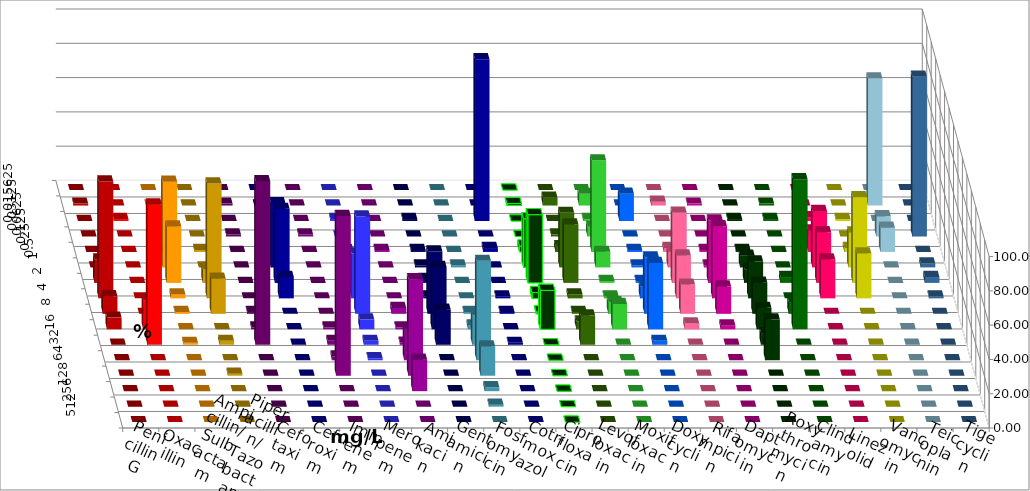
| Category | Penicillin G | Oxacillin | Ampicillin/ Sulbactam | Piperacillin/ Tazobactam | Cefotaxim | Cefuroxim | Imipenem | Meropenem | Amikacin | Gentamicin | Fosfomycin | Cotrimoxazol | Ciprofloxacin | Levofloxacin | Moxifloxacin | Doxycyclin | Rifampicin | Daptomycin | Roxythromycin | Clindamycin | Linezolid | Vancomycin | Teicoplanin | Tigecyclin |
|---|---|---|---|---|---|---|---|---|---|---|---|---|---|---|---|---|---|---|---|---|---|---|---|---|
| 0.015625 | 0 | 0 | 0 | 0 | 0 | 0 | 0 | 0 | 0 | 0 | 0 | 0 | 0 | 0 | 0 | 0 | 0 | 0 | 0 | 0 | 0 | 0 | 0 | 0 |
| 0.03125 | 1.136 | 0 | 0 | 0 | 1.136 | 0 | 0 | 0 | 0 | 0 | 0 | 0 | 1.136 | 4.545 | 6.818 | 0 | 2.273 | 1.136 | 0 | 1.136 | 0 | 0 | 0 | 74.118 |
| 0.0625 | 0 | 1.136 | 0 | 0 | 0 | 0 | 3.409 | 1.136 | 0 | 1.136 | 0 | 94.318 | 0 | 0 | 1.136 | 15.909 | 0 | 0 | 1.136 | 1.136 | 2.273 | 1.136 | 0 | 0 |
| 0.125 | 0 | 0 | 12.5 | 0 | 1.136 | 1.136 | 0 | 0 | 0 | 0 | 0 | 0 | 0 | 1.136 | 5.682 | 0 | 0 | 0 | 0 | 0 | 0 | 0 | 93.182 | 11.765 |
| 0.25 | 0 | 0 | 0 | 1.136 | 0 | 0 | 3.409 | 1.136 | 1.149 | 1.136 | 0 | 2.273 | 3.409 | 3.409 | 53.409 | 1.136 | 2.273 | 1.136 | 1.136 | 0 | 12.5 | 2.273 | 0 | 14.118 |
| 0.5 | 0 | 0 | 50 | 0 | 0 | 0 | 37.5 | 2.273 | 0 | 1.136 | 1.136 | 0 | 28.409 | 31.818 | 9.091 | 1.136 | 9.091 | 1.136 | 6.818 | 0 | 32.955 | 20.455 | 2.273 | 0 |
| 1.0 | 13.636 | 0 | 32.955 | 7.955 | 0 | 0 | 43.182 | 3.409 | 0 | 2.273 | 0 | 0 | 39.773 | 34.091 | 1.136 | 1.136 | 40.909 | 36.364 | 7.955 | 3.409 | 29.545 | 50 | 3.409 | 0 |
| 2.0 | 68.182 | 0 | 2.273 | 67.045 | 0 | 0 | 12.5 | 26.136 | 0 | 1.136 | 0 | 1.136 | 3.409 | 2.273 | 1.136 | 6.818 | 25 | 42.045 | 21.591 | 0 | 22.727 | 26.136 | 1.136 | 0 |
| 4.0 | 10.227 | 0 | 1.136 | 20.455 | 1.136 | 0 | 0 | 56.818 | 3.448 | 36.364 | 1.136 | 1.136 | 1.136 | 1.136 | 6.818 | 32.955 | 17.045 | 15.909 | 18.182 | 6.818 | 0 | 0 | 0 | 0 |
| 8.0 | 6.818 | 17.045 | 0 | 0 | 1.136 | 1.136 | 0 | 5.682 | 1.149 | 36.364 | 2.273 | 0 | 22.727 | 4.545 | 14.773 | 38.636 | 3.409 | 2.273 | 12.5 | 87.5 | 0 | 0 | 0 | 0 |
| 16.0 | 0 | 81.818 | 1.136 | 2.273 | 95.455 | 2.273 | 0 | 2.273 | 1.149 | 20.455 | 17.045 | 1.136 | 0 | 17.045 | 0 | 2.273 | 0 | 0 | 6.818 | 0 | 0 | 0 | 0 | 0 |
| 32.0 | 0 | 0 | 0 | 0 | 0 | 2.273 | 0 | 1.136 | 18.391 | 0 | 57.955 | 0 | 0 | 0 | 0 | 0 | 0 | 0 | 23.864 | 0 | 0 | 0 | 0 | 0 |
| 64.0 | 0 | 0 | 0 | 1.136 | 0 | 93.182 | 0 | 0 | 56.322 | 0 | 17.045 | 0 | 0 | 0 | 0 | 0 | 0 | 0 | 0 | 0 | 0 | 0 | 0 | 0 |
| 128.0 | 0 | 0 | 0 | 0 | 0 | 0 | 0 | 0 | 18.391 | 0 | 2.273 | 0 | 0 | 0 | 0 | 0 | 0 | 0 | 0 | 0 | 0 | 0 | 0 | 0 |
| 256.0 | 0 | 0 | 0 | 0 | 0 | 0 | 0 | 0 | 0 | 0 | 1.136 | 0 | 0 | 0 | 0 | 0 | 0 | 0 | 0 | 0 | 0 | 0 | 0 | 0 |
| 512.0 | 0 | 0 | 0 | 0 | 0 | 0 | 0 | 0 | 0 | 0 | 0 | 0 | 0 | 0 | 0 | 0 | 0 | 0 | 0 | 0 | 0 | 0 | 0 | 0 |